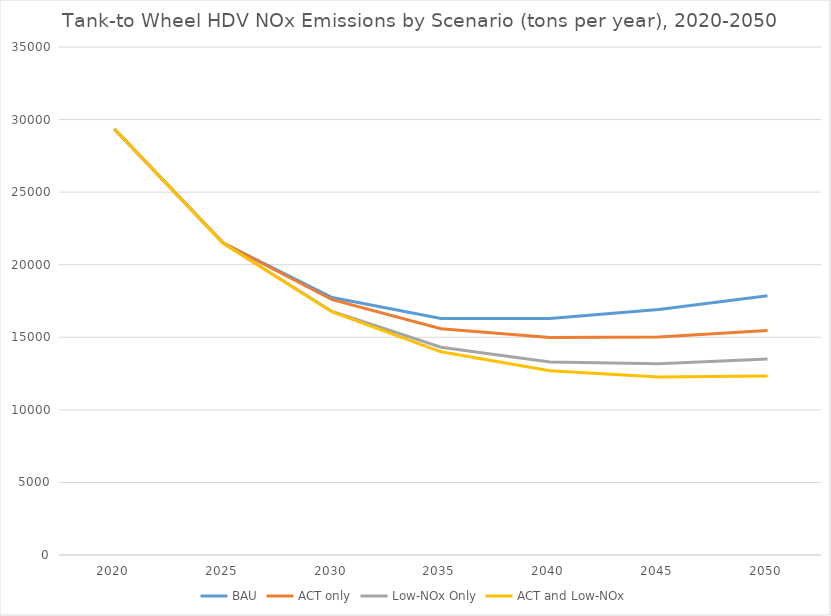
| Category | BAU | ACT only | Low-NOx Only | ACT and Low-NOx |
|---|---|---|---|---|
| 2020.0 | 29355.329 | 29355.329 | 29355.329 | 29355.329 |
| 2025.0 | 21493.27 | 21493.27 | 21467.765 | 21469.165 |
| 2030.0 | 17737.87 | 17588.364 | 16783.474 | 16741.688 |
| 2035.0 | 16288.367 | 15585.979 | 14310.67 | 13999.705 |
| 2040.0 | 16290.816 | 14986.833 | 13303.011 | 12700.325 |
| 2045.0 | 16917.889 | 15027.564 | 13180.967 | 12266.556 |
| 2050.0 | 17858.937 | 15468.05 | 13506.254 | 12327.105 |